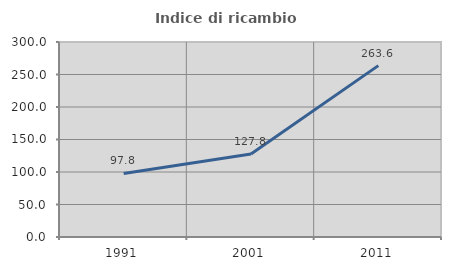
| Category | Indice di ricambio occupazionale  |
|---|---|
| 1991.0 | 97.759 |
| 2001.0 | 127.846 |
| 2011.0 | 263.647 |